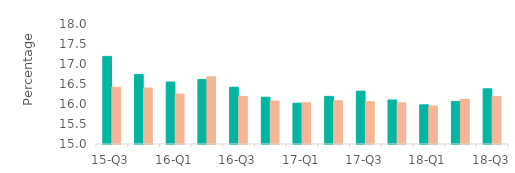
| Category | First-time
buyers | Home movers |
|---|---|---|
| 15-Q3 | 17.19 | 16.42 |
| 15-Q4 | 16.735 | 16.4 |
| 16-Q1 | 16.55 | 16.25 |
| 16-Q2 | 16.61 | 16.68 |
| 16-Q3 | 16.42 | 16.19 |
| 16-Q4 | 16.17 | 16.075 |
| 17-Q1 | 16.02 | 16.03 |
| 17-Q2 | 16.19 | 16.08 |
| 17-Q3 | 16.32 | 16.06 |
| 17-Q4 | 16.1 | 16.03 |
| 18-Q1 | 15.98 | 15.95 |
| 18-Q2 | 16.065 | 16.12 |
| 18-Q3 | 16.38 | 16.19 |